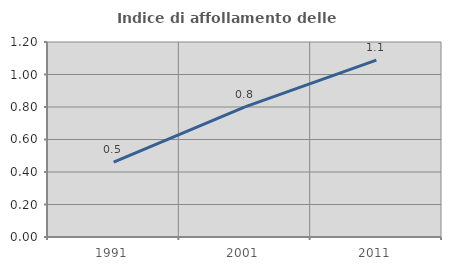
| Category | Indice di affollamento delle abitazioni  |
|---|---|
| 1991.0 | 0.461 |
| 2001.0 | 0.801 |
| 2011.0 | 1.088 |